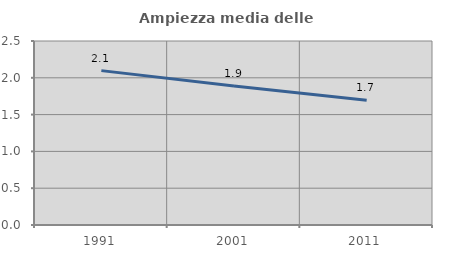
| Category | Ampiezza media delle famiglie |
|---|---|
| 1991.0 | 2.098 |
| 2001.0 | 1.888 |
| 2011.0 | 1.695 |